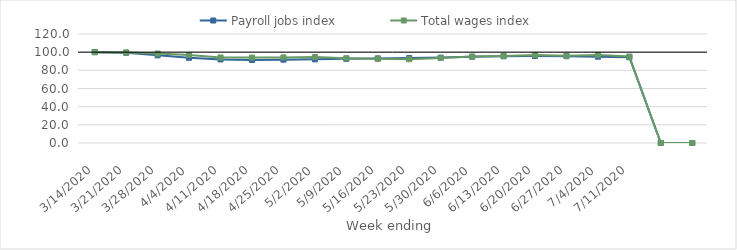
| Category | Payroll jobs index | Total wages index |
|---|---|---|
| 14/03/2020 | 100 | 100 |
| 21/03/2020 | 99.345 | 99.743 |
| 28/03/2020 | 96.491 | 98.481 |
| 04/04/2020 | 93.819 | 96.778 |
| 11/04/2020 | 91.996 | 94.184 |
| 18/04/2020 | 91.451 | 94.032 |
| 25/04/2020 | 91.738 | 94.241 |
| 02/05/2020 | 92.109 | 94.689 |
| 09/05/2020 | 92.629 | 93.316 |
| 16/05/2020 | 93.158 | 92.67 |
| 23/05/2020 | 93.449 | 92.26 |
| 30/05/2020 | 94.006 | 93.552 |
| 06/06/2020 | 94.942 | 95.15 |
| 13/06/2020 | 95.443 | 95.811 |
| 20/06/2020 | 95.785 | 96.851 |
| 27/06/2020 | 95.571 | 95.974 |
| 04/07/2020 | 95.033 | 96.971 |
| 11/07/2020 | 94.423 | 95.167 |